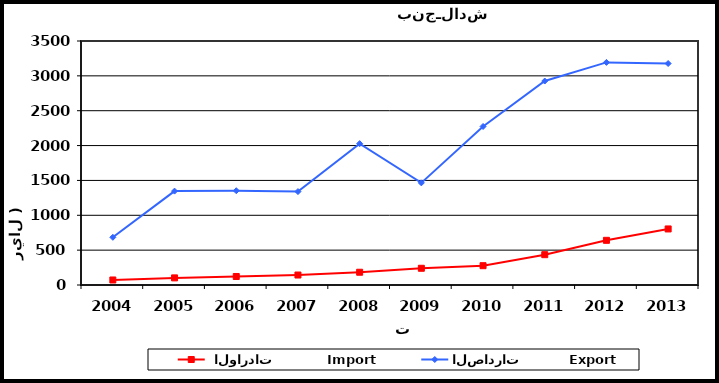
| Category |  الواردات           Import | الصادرات          Export |
|---|---|---|
| 2004.0 | 72 | 684 |
| 2005.0 | 102 | 1347 |
| 2006.0 | 122 | 1352 |
| 2007.0 | 143 | 1340 |
| 2008.0 | 183 | 2028 |
| 2009.0 | 240 | 1465 |
| 2010.0 | 277 | 2274 |
| 2011.0 | 435 | 2926 |
| 2012.0 | 641 | 3193 |
| 2013.0 | 804 | 3177 |